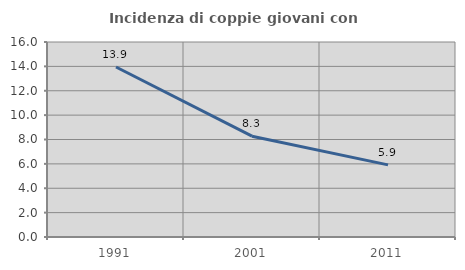
| Category | Incidenza di coppie giovani con figli |
|---|---|
| 1991.0 | 13.949 |
| 2001.0 | 8.273 |
| 2011.0 | 5.916 |